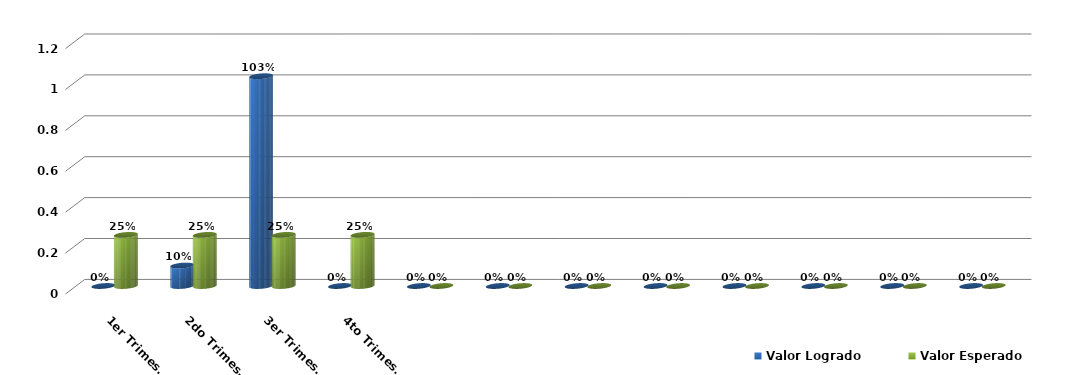
| Category | Valor Logrado | Valor Esperado |
|---|---|---|
| 1er Trimestre | 0 | 0.25 |
| 2do Trimestre | 0.1 | 0.25 |
| 3er Trimestre | 1.026 | 0.25 |
| 4to Trimestre | 0 | 0.25 |